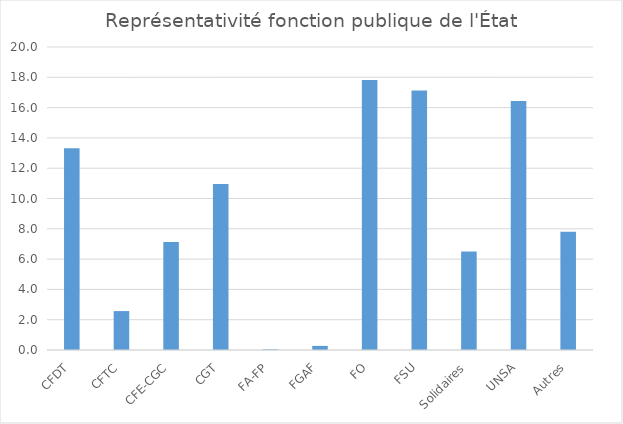
| Category | Series 0 |
|---|---|
| CFDT | 13.318 |
| CFTC | 2.569 |
| CFE-CGC | 7.125 |
| CGT | 10.95 |
| FA-FP | 0.044 |
| FGAF | 0.271 |
| FO | 17.83 |
| FSU | 17.137 |
| Solidaires | 6.506 |
| UNSA | 16.441 |
| Autres | 7.808 |